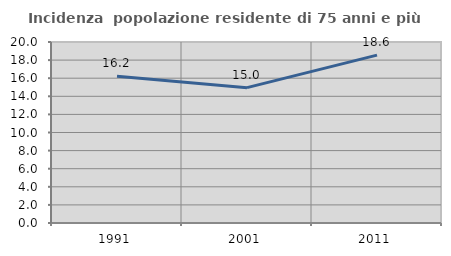
| Category | Incidenza  popolazione residente di 75 anni e più |
|---|---|
| 1991.0 | 16.228 |
| 2001.0 | 14.957 |
| 2011.0 | 18.552 |